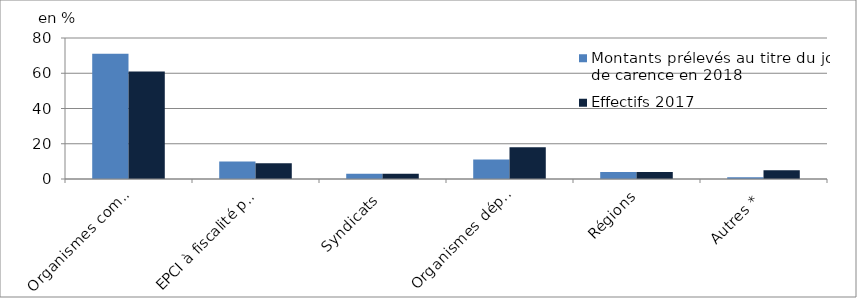
| Category | Montants prélevés au titre du jour de carence en 2018 | Effectifs 2017 |
|---|---|---|
| Organismes communaux | 71 | 61 |
| EPCI à fiscalité propre | 10 | 9 |
| Syndicats | 3 | 3 |
| Organismes départementaux | 11 | 18 |
| Régions | 4 | 4 |
| Autres * | 1 | 5 |